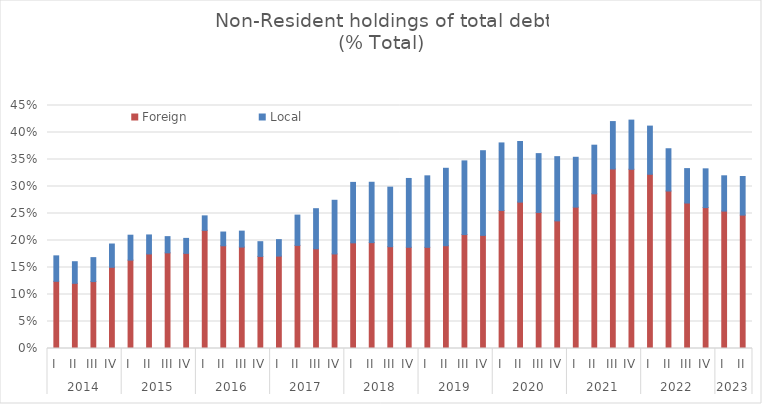
| Category | Foreign | Local |
|---|---|---|
| 0 | 0.124 | 0.047 |
| 1 | 0.121 | 0.04 |
| 2 | 0.124 | 0.044 |
| 3 | 0.15 | 0.043 |
| 4 | 0.164 | 0.046 |
| 5 | 0.175 | 0.035 |
| 6 | 0.177 | 0.03 |
| 7 | 0.176 | 0.028 |
| 8 | 0.219 | 0.027 |
| 9 | 0.19 | 0.025 |
| 10 | 0.188 | 0.03 |
| 11 | 0.171 | 0.027 |
| 12 | 0.171 | 0.031 |
| 13 | 0.191 | 0.056 |
| 14 | 0.185 | 0.074 |
| 15 | 0.175 | 0.099 |
| 16 | 0.196 | 0.112 |
| 17 | 0.196 | 0.112 |
| 18 | 0.189 | 0.11 |
| 19 | 0.187 | 0.127 |
| 20 | 0.187 | 0.132 |
| 21 | 0.19 | 0.143 |
| 22 | 0.211 | 0.136 |
| 23 | 0.209 | 0.157 |
| 24 | 0.256 | 0.125 |
| 25 | 0.271 | 0.112 |
| 26 | 0.252 | 0.109 |
| 27 | 0.236 | 0.119 |
| 28 | 0.262 | 0.092 |
| 29 | 0.286 | 0.09 |
| 30 | 0.332 | 0.088 |
| 31 | 0.332 | 0.091 |
| 32 | 0.323 | 0.089 |
| 33 | 0.292 | 0.078 |
| 34 | 0.269 | 0.064 |
| 35 | 0.261 | 0.072 |
| 36 | 0.254 | 0.065 |
| 37 | 0.247 | 0.071 |